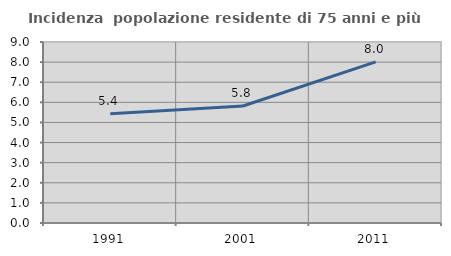
| Category | Incidenza  popolazione residente di 75 anni e più |
|---|---|
| 1991.0 | 5.432 |
| 2001.0 | 5.817 |
| 2011.0 | 8.015 |